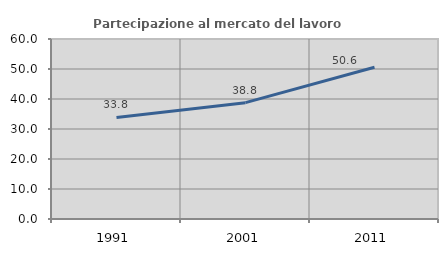
| Category | Partecipazione al mercato del lavoro  femminile |
|---|---|
| 1991.0 | 33.843 |
| 2001.0 | 38.779 |
| 2011.0 | 50.593 |